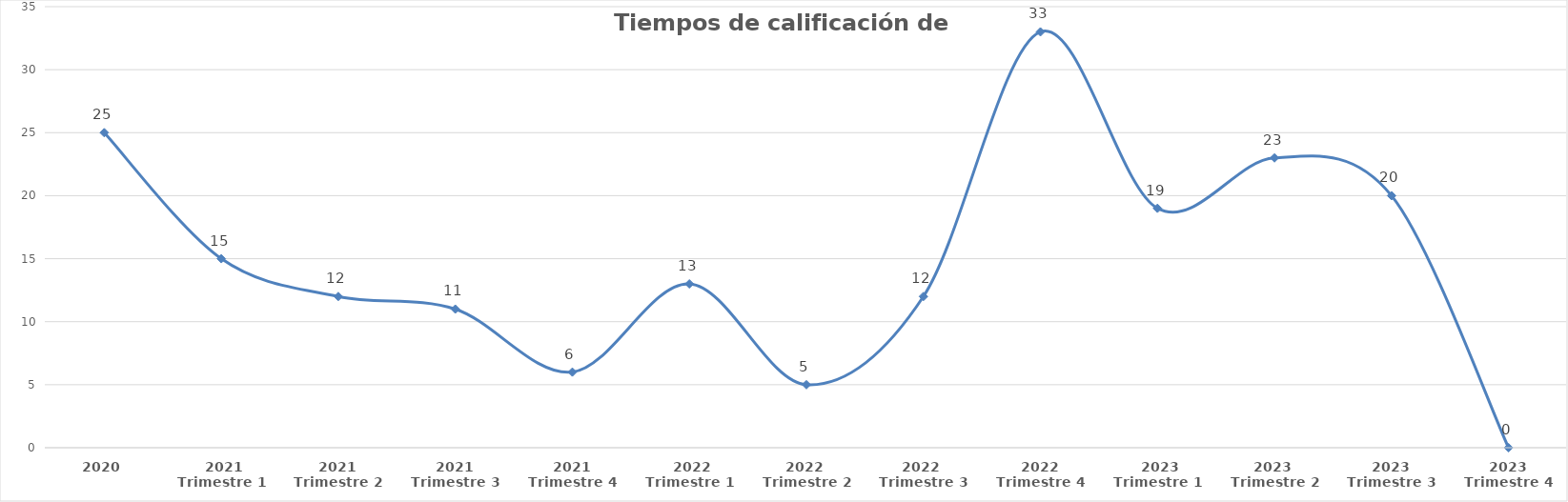
| Category | Series 0 |
|---|---|
| 2020 | 25 |
|  2021
Trimestre 1 | 15 |
| 2021
Trimestre 2 | 12 |
| 2021
Trimestre 3 | 11 |
| 2021
Trimestre 4 | 6 |
|  2022 Trimestre 1 | 13 |
| 2022 
Trimestre 2 | 5 |
| 2022 
Trimestre 3 | 12 |
| 2022
Trimestre 4 | 33 |
|  2023 Trimestre 1 | 19 |
| 2023 
Trimestre 2 | 23 |
| 2023
Trimestre 3 | 20 |
| 2023
Trimestre 4 | 0 |